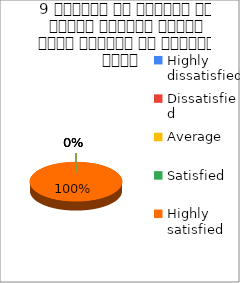
| Category | 9 शिक्षक ने शिक्षण के दौरान आधुनिक तकनीक पावर पॉइन्ट का प्रयोग किया   |
|---|---|
| Highly dissatisfied | 0 |
| Dissatisfied | 0 |
| Average | 0 |
| Satisfied | 0 |
| Highly satisfied | 1 |